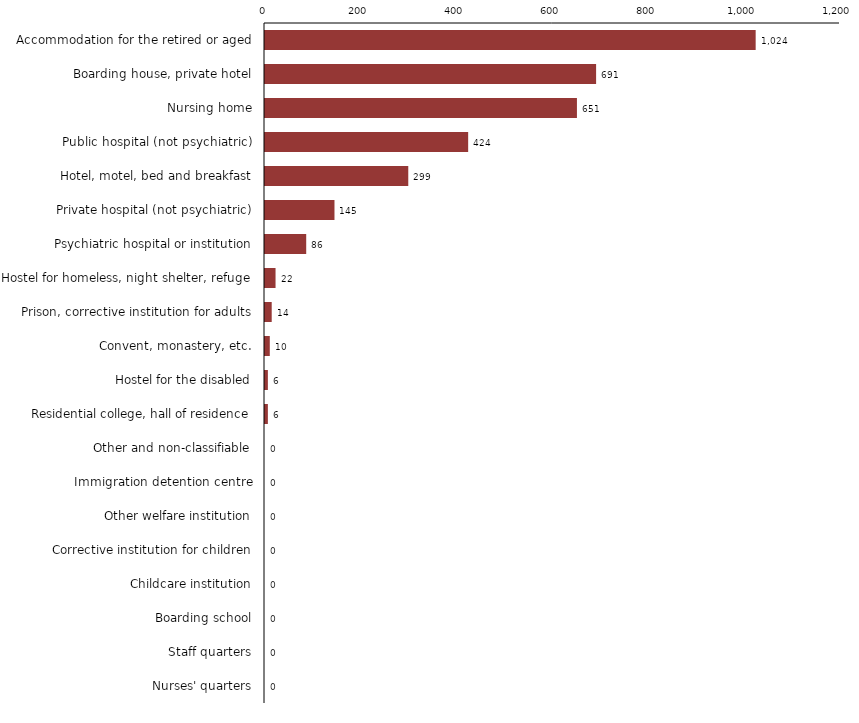
| Category | Series 0 |
|---|---|
| Accommodation for the retired or aged | 1024 |
| Boarding house, private hotel | 691 |
| Nursing home | 651 |
| Public hospital (not psychiatric) | 424 |
| Hotel, motel, bed and breakfast | 299 |
| Private hospital (not psychiatric) | 145 |
| Psychiatric hospital or institution | 86 |
| Hostel for homeless, night shelter, refuge | 22 |
| Prison, corrective institution for adults | 14 |
| Convent, monastery, etc. | 10 |
| Hostel for the disabled | 6 |
| Residential college, hall of residence | 6 |
| Other and non-classifiable | 0 |
| Immigration detention centre | 0 |
| Other welfare institution | 0 |
| Corrective institution for children | 0 |
| Childcare institution | 0 |
| Boarding school | 0 |
| Staff quarters | 0 |
| Nurses' quarters | 0 |